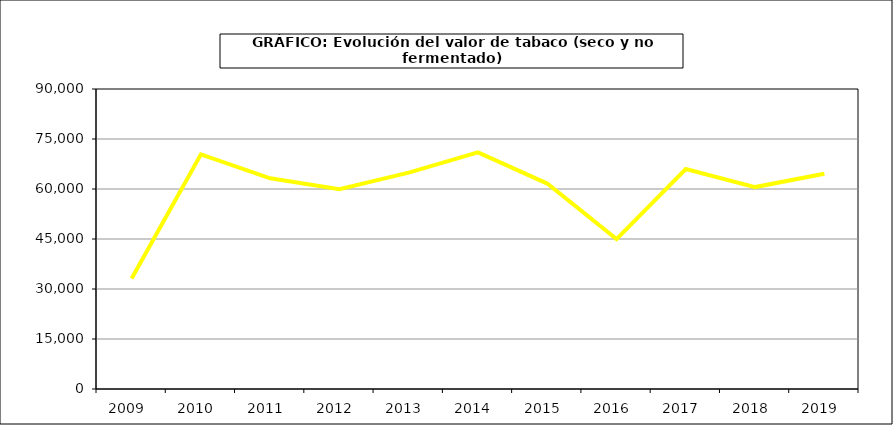
| Category | Valor |
|---|---|
| 2009.0 | 33141.373 |
| 2010.0 | 70384.847 |
| 2011.0 | 63219.669 |
| 2012.0 | 59963.648 |
| 2013.0 | 64900.043 |
| 2014.0 | 70983.122 |
| 2015.0 | 61634.5 |
| 2016.0 | 44972.9 |
| 2017.0 | 65979.385 |
| 2018.0 | 60574.168 |
| 2019.0 | 64589.269 |